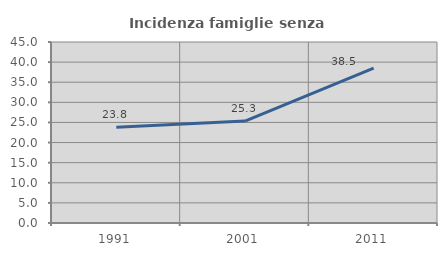
| Category | Incidenza famiglie senza nuclei |
|---|---|
| 1991.0 | 23.78 |
| 2001.0 | 25.347 |
| 2011.0 | 38.496 |